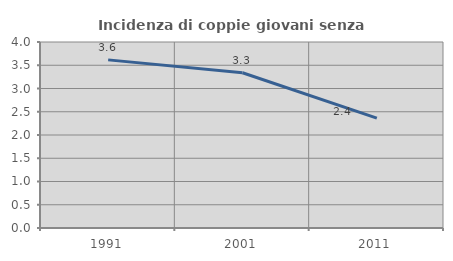
| Category | Incidenza di coppie giovani senza figli |
|---|---|
| 1991.0 | 3.616 |
| 2001.0 | 3.338 |
| 2011.0 | 2.363 |